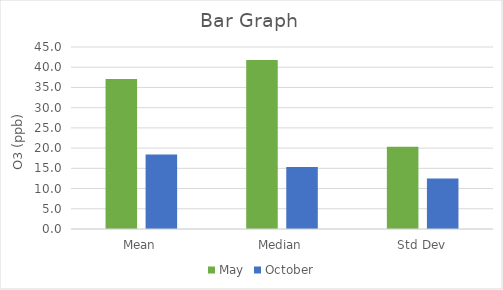
| Category | May | October |
|---|---|---|
| Mean | 37.06 | 18.401 |
| Median | 41.816 | 15.333 |
| Std Dev | 20.319 | 12.496 |